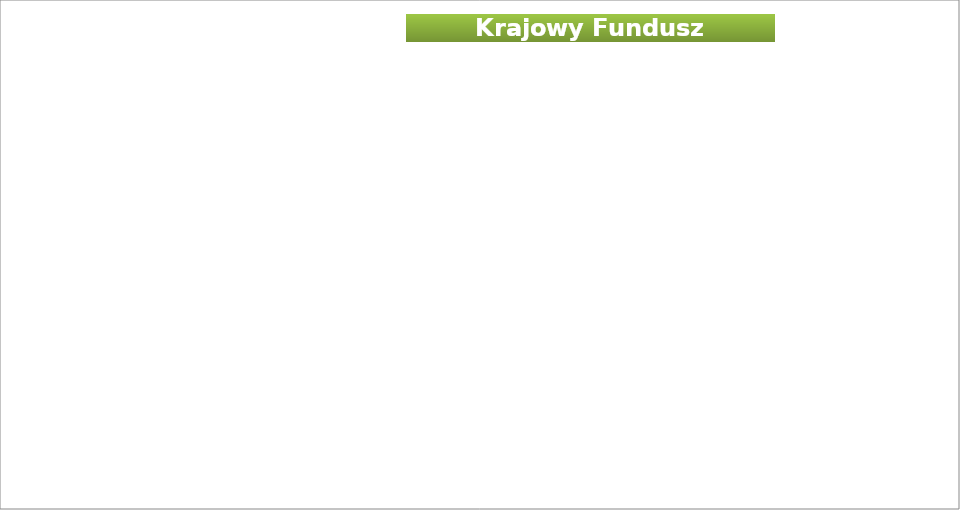
| Category | Finansowanie pracodawcom kosztów kształcenia ustawicznego Wnioski | Finansowanie pracodawcom kosztów kształcenia ustawicznego Otrzymali środki | Uczestnicy działań finansowanych z KFS Liczba pracodawców | Uczestnicy działań finansowanych z KFS Liczba pracowników |
|---|---|---|---|---|
| 2018.0 | 52 | 37 | 16 | 111 |
| 2019.0 | 157 | 102 | 29 | 233 |
| 2020.0 | 143 | 93 | 29 | 253 |
| 2021.0 | 169 | 87 | 37 | 206 |